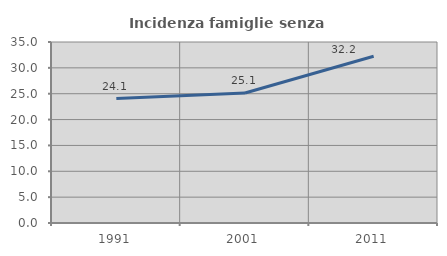
| Category | Incidenza famiglie senza nuclei |
|---|---|
| 1991.0 | 24.054 |
| 2001.0 | 25.134 |
| 2011.0 | 32.237 |